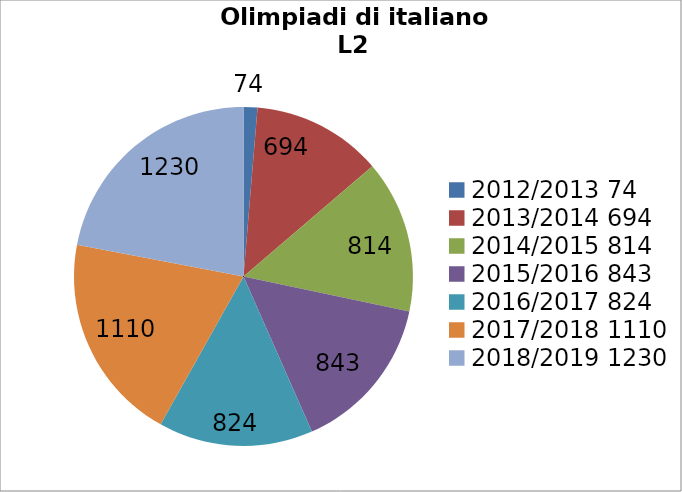
| Category | Alunni iscritti |
|---|---|
| 0 | 74 |
| 1 | 694 |
| 2 | 814 |
| 3 | 843 |
| 4 | 824 |
| 5 | 1110 |
| 6 | 1230 |